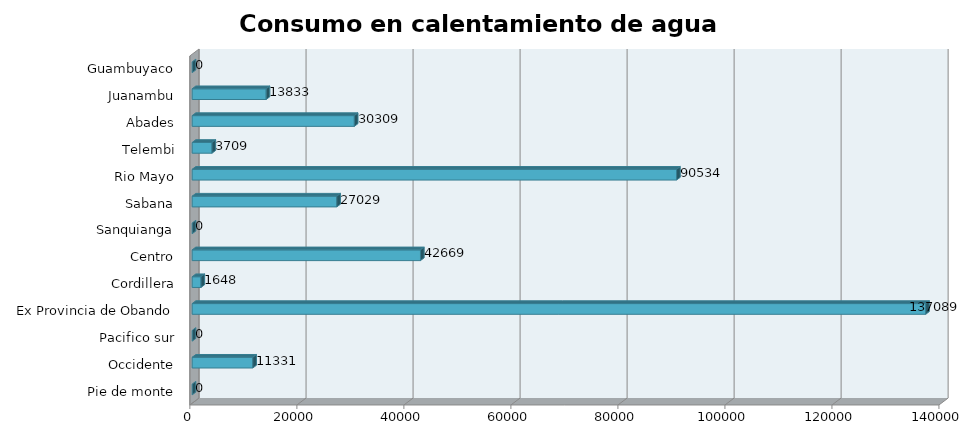
| Category | Series 0 |
|---|---|
| Pie de monte | 0 |
| Occidente | 11331.132 |
| Pacifico sur | 0 |
| Ex Provincia de Obando | 137089.057 |
| Cordillera | 1647.92 |
| Centro | 42669.488 |
| Sanquianga | 0 |
| Sabana | 27028.752 |
| Rio Mayo | 90534.342 |
| Telembi | 3709.259 |
| Abades | 30308.693 |
| Juanambu | 13833.023 |
| Guambuyaco | 0 |